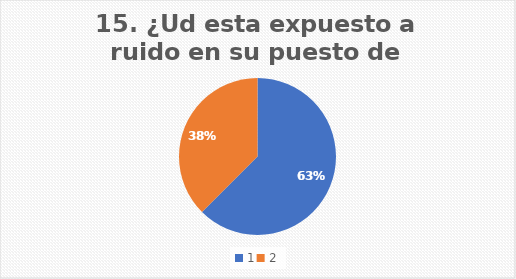
| Category | ¿Ud esta expuesto a ruido en su puesto de trabajo? |
|---|---|
| 0 | 62.5 |
| 1 | 37.5 |